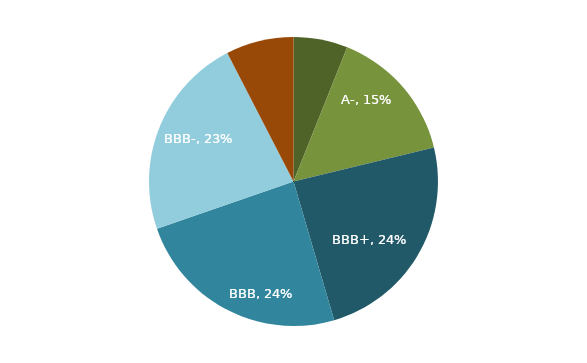
| Category | Series 0 |
|---|---|
| A or higher | 0.061 |
| A- | 0.152 |
| BBB+ | 0.242 |
| BBB | 0.242 |
| BBB- | 0.227 |
| Below BBB- | 0.076 |